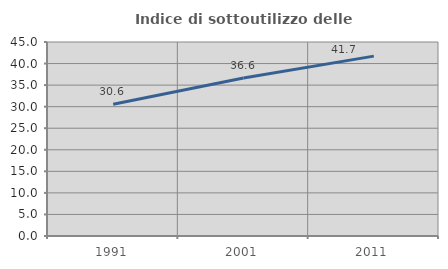
| Category | Indice di sottoutilizzo delle abitazioni  |
|---|---|
| 1991.0 | 30.569 |
| 2001.0 | 36.645 |
| 2011.0 | 41.721 |